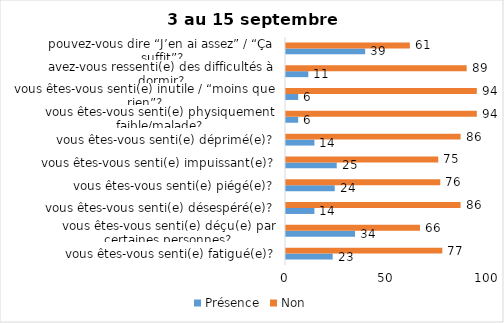
| Category | Présence | Non |
|---|---|---|
| vous êtes-vous senti(e) fatigué(e)? | 23 | 77 |
| vous êtes-vous senti(e) déçu(e) par certaines personnes? | 34 | 66 |
| vous êtes-vous senti(e) désespéré(e)? | 14 | 86 |
| vous êtes-vous senti(e) piégé(e)? | 24 | 76 |
| vous êtes-vous senti(e) impuissant(e)? | 25 | 75 |
| vous êtes-vous senti(e) déprimé(e)? | 14 | 86 |
| vous êtes-vous senti(e) physiquement faible/malade? | 6 | 94 |
| vous êtes-vous senti(e) inutile / “moins que rien”? | 6 | 94 |
| avez-vous ressenti(e) des difficultés à dormir? | 11 | 89 |
| pouvez-vous dire “J’en ai assez” / “Ça suffit”? | 39 | 61 |